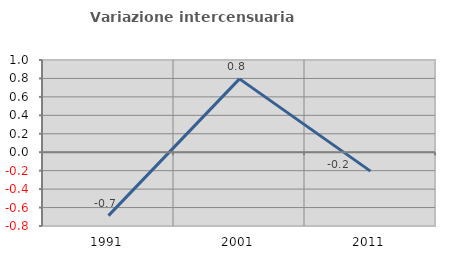
| Category | Variazione intercensuaria annua |
|---|---|
| 1991.0 | -0.688 |
| 2001.0 | 0.795 |
| 2011.0 | -0.205 |